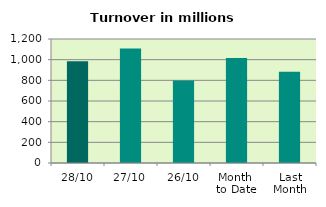
| Category | Series 0 |
|---|---|
| 28/10 | 983.674 |
| 27/10 | 1108.807 |
| 26/10 | 798.079 |
| Month 
to Date | 1017.169 |
| Last
Month | 883.598 |